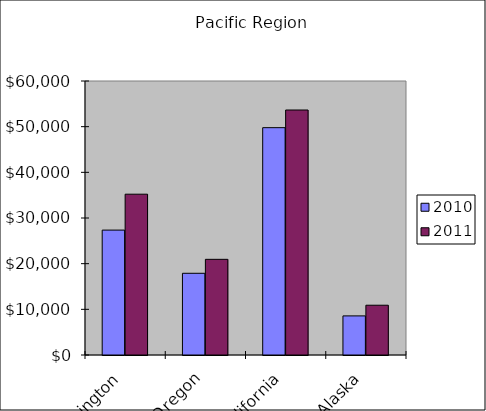
| Category | 2010 | 2011 |
|---|---|---|
| Washington | 27350 | 35212 |
| Oregon | 17892 | 20950 |
| California | 49781 | 53647 |
| Alaska | 8563 | 10898 |